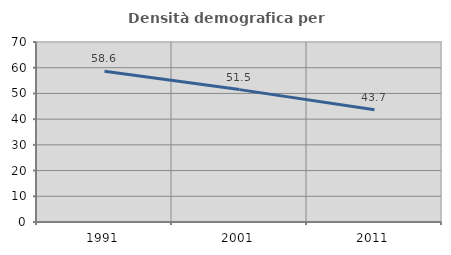
| Category | Densità demografica |
|---|---|
| 1991.0 | 58.631 |
| 2001.0 | 51.485 |
| 2011.0 | 43.655 |